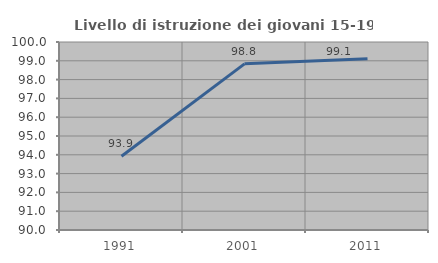
| Category | Livello di istruzione dei giovani 15-19 anni |
|---|---|
| 1991.0 | 93.925 |
| 2001.0 | 98.837 |
| 2011.0 | 99.107 |